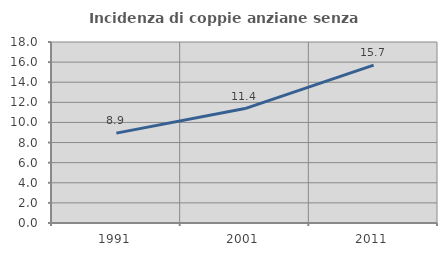
| Category | Incidenza di coppie anziane senza figli  |
|---|---|
| 1991.0 | 8.937 |
| 2001.0 | 11.38 |
| 2011.0 | 15.7 |